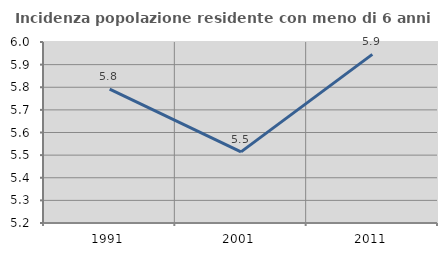
| Category | Incidenza popolazione residente con meno di 6 anni |
|---|---|
| 1991.0 | 5.791 |
| 2001.0 | 5.514 |
| 2011.0 | 5.945 |